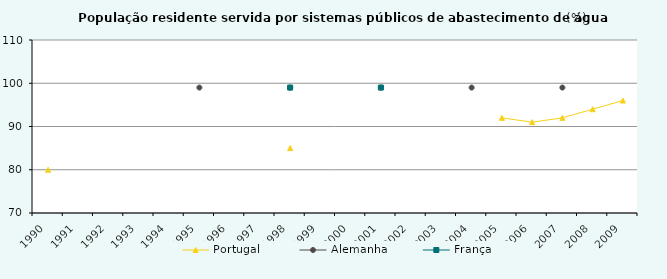
| Category | Portugal  | Alemanha | França |
|---|---|---|---|
| 1990.0 | 80 | 0 | 0 |
| 1991.0 | 0 | 0 | 0 |
| 1992.0 | 0 | 0 | 0 |
| 1993.0 | 0 | 0 | 0 |
| 1994.0 | 0 | 0 | 0 |
| 1995.0 | 0 | 99 | 0 |
| 1996.0 | 0 | 0 | 0 |
| 1997.0 | 0 | 0 | 0 |
| 1998.0 | 85 | 99 | 99 |
| 1999.0 | 0 | 0 | 0 |
| 2000.0 | 0 | 0 | 0 |
| 2001.0 | 0 | 99 | 99 |
| 2002.0 | 0 | 0 | 0 |
| 2003.0 | 0 | 0 | 0 |
| 2004.0 | 0 | 99 | 0 |
| 2005.0 | 92 | 0 | 0 |
| 2006.0 | 91 | 0 | 0 |
| 2007.0 | 92 | 99 | 0 |
| 2008.0 | 94 | 0 | 0 |
| 2009.0 | 96 | 0 | 0 |